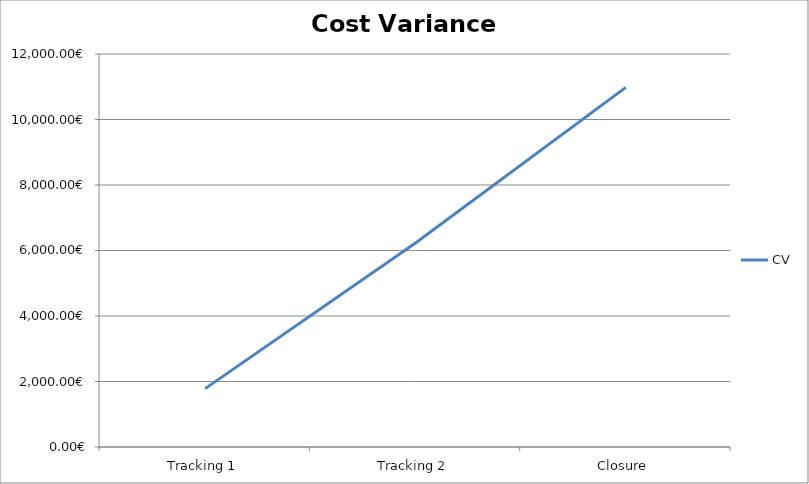
| Category | CV |
|---|---|
| Tracking 1 | 1782.3 |
| Tracking 2 | 6230.526 |
| Closure | 10980 |